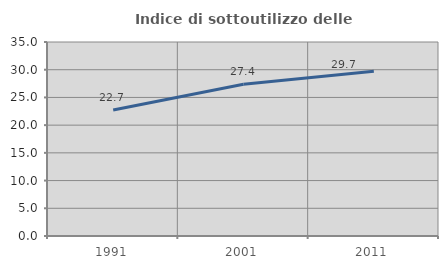
| Category | Indice di sottoutilizzo delle abitazioni  |
|---|---|
| 1991.0 | 22.727 |
| 2001.0 | 27.368 |
| 2011.0 | 29.74 |